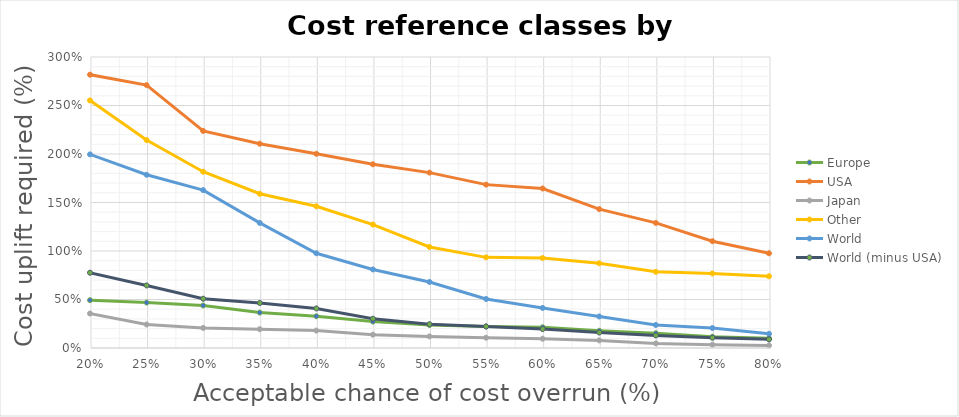
| Category | Europe | USA | Japan | Other | World | World (minus USA) |
|---|---|---|---|---|---|---|
| 0.8 | 0.101 | 0.977 | 0.026 | 0.739 | 0.146 | 0.089 |
| 0.75 | 0.117 | 1.101 | 0.034 | 0.768 | 0.206 | 0.106 |
| 0.7 | 0.152 | 1.29 | 0.048 | 0.785 | 0.237 | 0.129 |
| 0.65 | 0.177 | 1.432 | 0.079 | 0.874 | 0.325 | 0.16 |
| 0.6 | 0.214 | 1.644 | 0.096 | 0.928 | 0.413 | 0.195 |
| 0.55 | 0.222 | 1.684 | 0.106 | 0.935 | 0.505 | 0.222 |
| 0.5 | 0.237 | 1.808 | 0.119 | 1.041 | 0.681 | 0.246 |
| 0.45 | 0.272 | 1.894 | 0.137 | 1.273 | 0.81 | 0.302 |
| 0.399999999999999 | 0.327 | 2.002 | 0.18 | 1.461 | 0.977 | 0.408 |
| 0.349999999999999 | 0.365 | 2.106 | 0.194 | 1.59 | 1.29 | 0.465 |
| 0.299999999999999 | 0.438 | 2.237 | 0.207 | 1.817 | 1.627 | 0.508 |
| 0.249999999999999 | 0.469 | 2.71 | 0.242 | 2.144 | 1.786 | 0.645 |
| 0.199999999999999 | 0.493 | 2.818 | 0.355 | 2.552 | 1.996 | 0.776 |